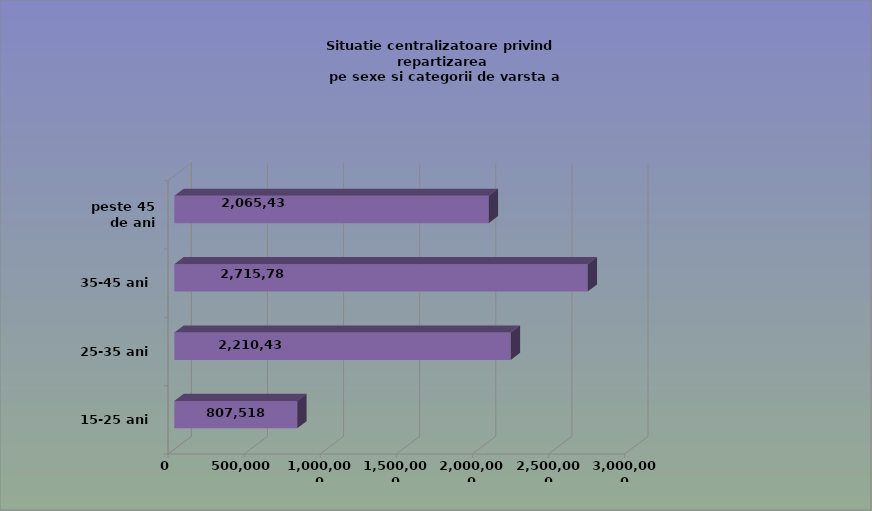
| Category | 15-25 ani 25-35 ani 35-45 ani peste 45 de ani |
|---|---|
| 15-25 ani | 807518 |
| 25-35 ani | 2210430 |
| 35-45 ani | 2715784 |
| peste 45 de ani | 2065431 |